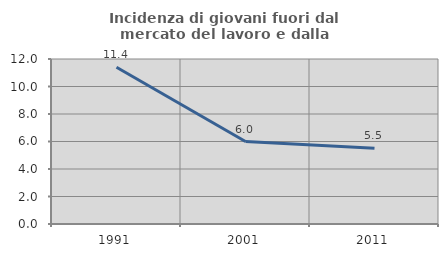
| Category | Incidenza di giovani fuori dal mercato del lavoro e dalla formazione  |
|---|---|
| 1991.0 | 11.404 |
| 2001.0 | 6 |
| 2011.0 | 5.503 |